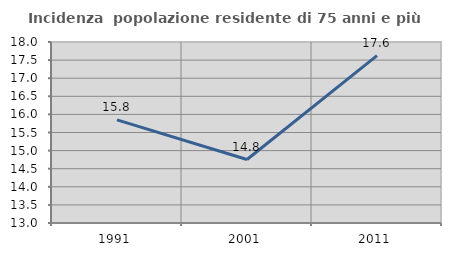
| Category | Incidenza  popolazione residente di 75 anni e più |
|---|---|
| 1991.0 | 15.849 |
| 2001.0 | 14.754 |
| 2011.0 | 17.625 |